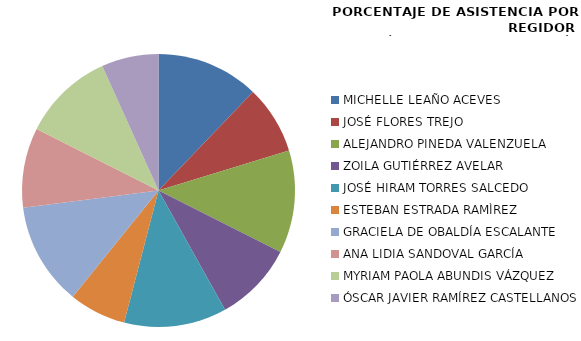
| Category | Series 0 |
|---|---|
| MICHELLE LEAÑO ACEVES | 100 |
| JOSÉ FLORES TREJO | 66.667 |
| ALEJANDRO PINEDA VALENZUELA | 100 |
| ZOILA GUTIÉRREZ AVELAR | 77.778 |
| JOSÉ HIRAM TORRES SALCEDO | 100 |
| ESTEBAN ESTRADA RAMÌREZ | 55.556 |
| GRACIELA DE OBALDÍA ESCALANTE | 100 |
| ANA LIDIA SANDOVAL GARCÍA | 77.778 |
| MYRIAM PAOLA ABUNDIS VÁZQUEZ | 88.889 |
| ÓSCAR JAVIER RAMÍREZ CASTELLANOS | 55.556 |